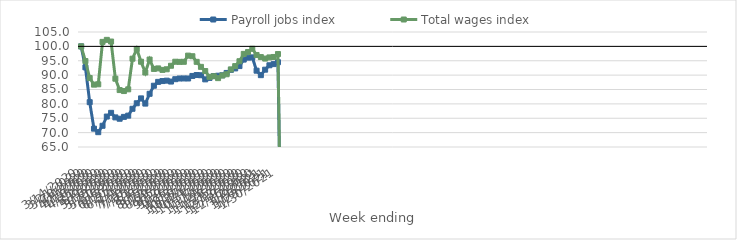
| Category | Payroll jobs index | Total wages index |
|---|---|---|
| 14/03/2020 | 100 | 100 |
| 21/03/2020 | 92.699 | 94.894 |
| 28/03/2020 | 80.592 | 88.985 |
| 04/04/2020 | 71.38 | 86.692 |
| 11/04/2020 | 70.157 | 86.814 |
| 18/04/2020 | 72.377 | 101.565 |
| 25/04/2020 | 75.59 | 102.27 |
| 02/05/2020 | 76.885 | 101.681 |
| 09/05/2020 | 75.297 | 88.76 |
| 16/05/2020 | 74.832 | 84.803 |
| 23/05/2020 | 75.478 | 84.458 |
| 30/05/2020 | 75.902 | 85.055 |
| 06/06/2020 | 78.29 | 95.722 |
| 13/06/2020 | 80.215 | 99.085 |
| 20/06/2020 | 81.91 | 94.658 |
| 27/06/2020 | 80.098 | 90.908 |
| 04/07/2020 | 83.501 | 95.424 |
| 11/07/2020 | 86.312 | 92.156 |
| 18/07/2020 | 87.653 | 92.341 |
| 25/07/2020 | 87.936 | 91.818 |
| 01/08/2020 | 88.081 | 92.033 |
| 08/08/2020 | 87.763 | 93.258 |
| 15/08/2020 | 88.585 | 94.661 |
| 22/08/2020 | 88.827 | 94.61 |
| 29/08/2020 | 88.843 | 94.631 |
| 05/09/2020 | 88.827 | 96.784 |
| 12/09/2020 | 89.714 | 96.576 |
| 19/09/2020 | 90.034 | 94.624 |
| 26/09/2020 | 89.958 | 92.88 |
| 03/10/2020 | 88.523 | 91.418 |
| 10/10/2020 | 89.031 | 89.4 |
| 17/10/2020 | 89.681 | 89.616 |
| 24/10/2020 | 89.794 | 88.956 |
| 31/10/2020 | 89.941 | 89.86 |
| 07/11/2020 | 90.758 | 90.303 |
| 14/11/2020 | 91.833 | 91.987 |
| 21/11/2020 | 92.336 | 93.131 |
| 28/11/2020 | 93.142 | 94.836 |
| 05/12/2020 | 95.402 | 97.386 |
| 12/12/2020 | 96.08 | 98.018 |
| 19/12/2020 | 96.178 | 99.164 |
| 26/12/2020 | 91.544 | 97.007 |
| 02/01/2021 | 89.988 | 96.278 |
| 09/01/2021 | 91.894 | 95.758 |
| 16/01/2021 | 93.426 | 96.162 |
| 23/01/2021 | 93.836 | 96.315 |
| 30/01/2021 | 94.49 | 97.336 |